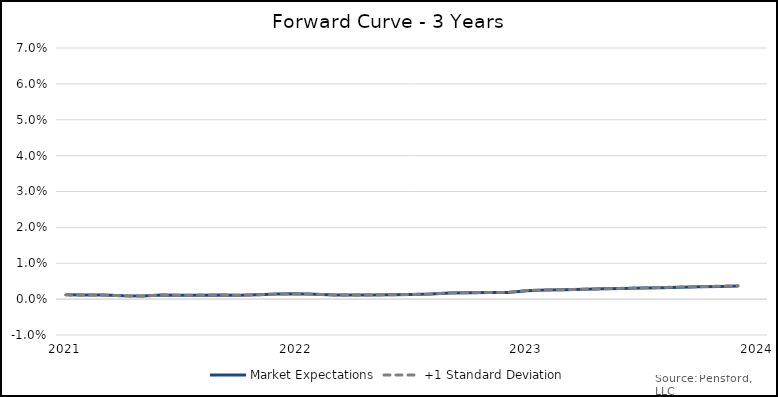
| Category | Market Expectations | +1 Standard Deviation |
|---|---|---|
| 2021-01-31 | 0.001 | 0.001 |
| 2021-02-28 | 0.001 | 0.001 |
| 2021-03-28 | 0.001 | 0.001 |
| 2021-04-28 | 0.001 | 0.001 |
| 2021-05-28 | 0.001 | 0.001 |
| 2021-06-28 | 0.001 | 0.001 |
| 2021-07-28 | 0.001 | 0.001 |
| 2021-08-28 | 0.001 | 0.001 |
| 2021-09-28 | 0.001 | 0.001 |
| 2021-10-28 | 0.001 | 0.001 |
| 2021-11-28 | 0.001 | 0.001 |
| 2021-12-28 | 0.001 | 0.001 |
| 2022-01-28 | 0.001 | 0.001 |
| 2022-02-28 | 0.001 | 0.001 |
| 2022-03-28 | 0.001 | 0.001 |
| 2022-04-28 | 0.001 | 0.001 |
| 2022-05-28 | 0.001 | 0.001 |
| 2022-06-28 | 0.001 | 0.001 |
| 2022-07-28 | 0.001 | 0.001 |
| 2022-08-28 | 0.001 | 0.001 |
| 2022-09-28 | 0.002 | 0.002 |
| 2022-10-28 | 0.002 | 0.002 |
| 2022-11-28 | 0.002 | 0.002 |
| 2022-12-28 | 0.002 | 0.002 |
| 2023-01-28 | 0.002 | 0.002 |
| 2023-02-28 | 0.003 | 0.003 |
| 2023-03-28 | 0.003 | 0.003 |
| 2023-04-28 | 0.003 | 0.003 |
| 2023-05-28 | 0.003 | 0.003 |
| 2023-06-28 | 0.003 | 0.003 |
| 2023-07-28 | 0.003 | 0.003 |
| 2023-08-28 | 0.003 | 0.003 |
| 2023-09-28 | 0.003 | 0.003 |
| 2023-10-28 | 0.003 | 0.003 |
| 2023-11-28 | 0.004 | 0.004 |
| 2023-12-28 | 0.004 | 0.004 |
| 2024-01-28 | 0.005 | 0.005 |
| 2024-02-28 | 0.005 | 0.005 |
| 2024-03-28 | 0.005 | 0.006 |
| 2024-04-28 | 0.006 | 0.006 |
| 2024-05-28 | 0.006 | 0.006 |
| 2024-06-28 | 0.006 | 0.006 |
| 2024-07-28 | 0.006 | 0.006 |
| 2024-08-28 | 0.007 | 0.007 |
| 2024-09-28 | 0.007 | 0.007 |
| 2024-10-28 | 0.007 | 0.007 |
| 2024-11-28 | 0.007 | 0.007 |
| 2024-12-28 | 0.007 | 0.007 |
| 2025-01-28 | 0.008 | 0.008 |
| 2025-02-28 | 0.009 | 0.009 |
| 2025-03-28 | 0.009 | 0.009 |
| 2025-04-28 | 0.009 | 0.009 |
| 2025-05-28 | 0.009 | 0.009 |
| 2025-06-28 | 0.009 | 0.01 |
| 2025-07-28 | 0.01 | 0.01 |
| 2025-08-28 | 0.01 | 0.01 |
| 2025-09-28 | 0.01 | 0.01 |
| 2025-10-28 | 0.01 | 0.011 |
| 2025-11-28 | 0.011 | 0.011 |
| 2025-12-28 | 0.011 | 0.011 |
| 2026-01-28 | 0.011 | 0.012 |
| 2026-02-28 | 0.012 | 0.012 |
| 2026-03-28 | 0.012 | 0.012 |
| 2026-04-28 | 0.012 | 0.012 |
| 2026-05-28 | 0.012 | 0.013 |
| 2026-06-28 | 0.013 | 0.013 |
| 2026-07-28 | 0.013 | 0.013 |
| 2026-08-28 | 0.013 | 0.013 |
| 2026-09-28 | 0.013 | 0.014 |
| 2026-10-28 | 0.014 | 0.014 |
| 2026-11-28 | 0.014 | 0.014 |
| 2026-12-28 | 0.014 | 0.014 |
| 2027-01-28 | 0.014 | 0.014 |
| 2027-02-28 | 0.014 | 0.014 |
| 2027-03-28 | 0.014 | 0.014 |
| 2027-04-28 | 0.014 | 0.015 |
| 2027-05-28 | 0.015 | 0.015 |
| 2027-06-28 | 0.015 | 0.015 |
| 2027-07-28 | 0.015 | 0.015 |
| 2027-08-28 | 0.015 | 0.015 |
| 2027-09-28 | 0.015 | 0.016 |
| 2027-10-28 | 0.016 | 0.016 |
| 2027-11-28 | 0.016 | 0.016 |
| 2027-12-28 | 0.016 | 0.016 |
| 2028-01-28 | 0.015 | 0.016 |
| 2028-02-28 | 0.015 | 0.016 |
| 2028-03-28 | 0.016 | 0.016 |
| 2028-04-28 | 0.016 | 0.016 |
| 2028-05-28 | 0.016 | 0.016 |
| 2028-06-28 | 0.016 | 0.016 |
| 2028-07-28 | 0.016 | 0.017 |
| 2028-08-28 | 0.017 | 0.017 |
| 2028-09-28 | 0.017 | 0.017 |
| 2028-10-28 | 0.017 | 0.017 |
| 2028-11-28 | 0.017 | 0.017 |
| 2028-12-28 | 0.017 | 0.018 |
| 2029-01-28 | 0.017 | 0.017 |
| 2029-02-28 | 0.017 | 0.017 |
| 2029-03-28 | 0.017 | 0.017 |
| 2029-04-28 | 0.017 | 0.017 |
| 2029-05-28 | 0.017 | 0.017 |
| 2029-06-28 | 0.017 | 0.017 |
| 2029-07-28 | 0.017 | 0.018 |
| 2029-08-28 | 0.018 | 0.018 |
| 2029-09-28 | 0.018 | 0.018 |
| 2029-10-28 | 0.018 | 0.018 |
| 2029-11-28 | 0.018 | 0.018 |
| 2029-12-28 | 0.018 | 0.018 |
| 2030-01-28 | 0.018 | 0.018 |
| 2030-02-28 | 0.017 | 0.018 |
| 2030-03-28 | 0.018 | 0.018 |
| 2030-04-28 | 0.018 | 0.018 |
| 2030-05-28 | 0.018 | 0.018 |
| 2030-06-28 | 0.018 | 0.018 |
| 2030-07-28 | 0.018 | 0.018 |
| 2030-08-28 | 0.018 | 0.019 |
| 2030-09-28 | 0.018 | 0.019 |
| 2030-10-28 | 0.019 | 0.019 |
| 2030-11-28 | 0.019 | 0.019 |
| 2030-12-28 | 0.019 | 0.019 |